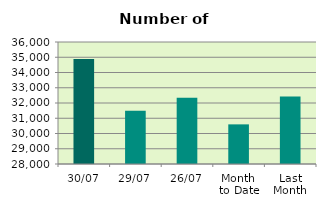
| Category | Series 0 |
|---|---|
| 30/07 | 34890 |
| 29/07 | 31492 |
| 26/07 | 32346 |
| Month 
to Date | 30598.818 |
| Last
Month | 32421.5 |